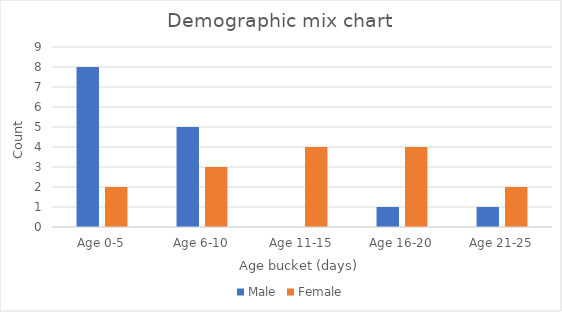
| Category | Male | Female |
|---|---|---|
| Age 0-5 | 8 | 2 |
| Age 6-10 | 5 | 3 |
| Age 11-15 | 0 | 4 |
| Age 16-20 | 1 | 4 |
| Age 21-25 | 1 | 2 |